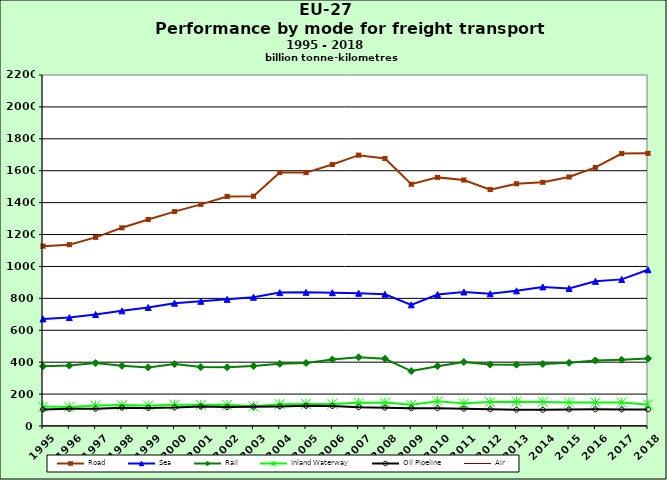
| Category | Road | Sea | Rail | Inland Waterway | Oil Pipeline | Air |
|---|---|---|---|---|---|---|
| 1995.0 | 1127.16 | 671.365 | 374.818 | 121.918 | 103.81 | 1.418 |
| 1996.0 | 1136.379 | 679.567 | 378.763 | 119.598 | 107.707 | 1.461 |
| 1997.0 | 1182.478 | 698.9 | 394.352 | 127.72 | 107.669 | 1.546 |
| 1998.0 | 1242.204 | 721.747 | 377.038 | 130.914 | 114.674 | 1.596 |
| 1999.0 | 1294.362 | 742.837 | 367.11 | 128.619 | 113.214 | 1.631 |
| 2000.0 | 1343.867 | 769.785 | 387.921 | 133.715 | 115.683 | 1.737 |
| 2001.0 | 1389.253 | 781.502 | 369.253 | 132.416 | 122.375 | 1.744 |
| 2002.0 | 1438.8 | 793.805 | 368.161 | 132.414 | 118.797 | 1.702 |
| 2003.0 | 1440.54 | 807.279 | 376.309 | 123.435 | 121.204 | 1.716 |
| 2004.0 | 1588.266 | 835.985 | 390.035 | 136.763 | 122.602 | 1.78 |
| 2005.0 | 1588.154 | 838.028 | 394.597 | 138.611 | 126.809 | 1.83 |
| 2006.0 | 1638.795 | 835.613 | 416.246 | 138.417 | 125.789 | 1.886 |
| 2007.0 | 1697.644 | 832.218 | 430.724 | 145.402 | 118.222 | 1.95 |
| 2008.0 | 1676.462 | 825.932 | 421.686 | 146.903 | 114.765 | 1.913 |
| 2009.0 | 1515.317 | 759.602 | 344.369 | 132.606 | 111.634 | 1.81 |
| 2010.0 | 1558.293 | 824.187 | 374.955 | 155.365 | 110.968 | 1.84 |
| 2011.0 | 1541.631 | 839.892 | 401.122 | 141.825 | 108.27 | 1.855 |
| 2012.0 | 1481.69 | 828.541 | 385.189 | 149.822 | 104.983 | 1.825 |
| 2013.0 | 1518.42 | 847.123 | 384.319 | 152.584 | 102.083 | 1.837 |
| 2014.0 | 1527.438 | 871.718 | 388.68 | 150.707 | 101.086 | 2.116 |
| 2015.0 | 1560.889 | 861.78 | 395.893 | 147.351 | 104.15 | 2.142 |
| 2016.0 | 1620.58 | 906.65 | 411.057 | 147.209 | 104.697 | 2.4 |
| 2017.0 | 1707.308 | 918.995 | 414.815 | 147.223 | 103.951 | 2.173 |
| 2018.0 | 1708.909 | 979.165 | 423.325 | 134.984 | 104.045 | 2.216 |